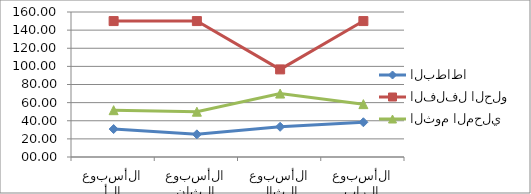
| Category | البطاطا | الفلفل الحلو | الثوم المحلي |
|---|---|---|---|
| 0 | 30.83 | 150 | 51.66 |
| 1 | 25 | 150 | 50 |
| 2 | 33.33 | 96.66 | 70 |
| 3 | 38.33 | 150 | 58.33 |